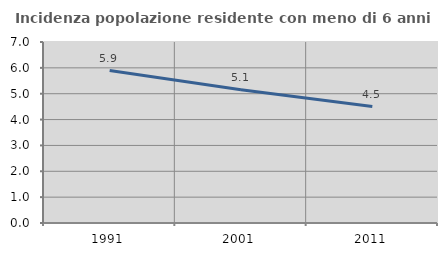
| Category | Incidenza popolazione residente con meno di 6 anni |
|---|---|
| 1991.0 | 5.894 |
| 2001.0 | 5.15 |
| 2011.0 | 4.505 |